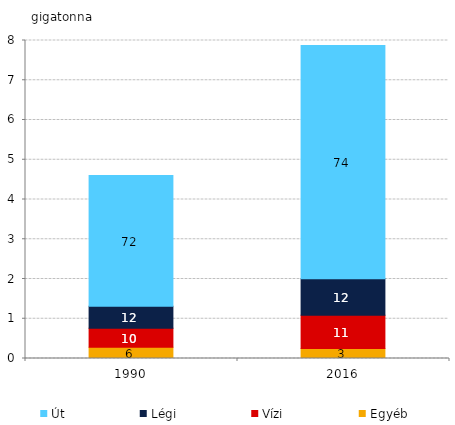
| Category | Egyéb | Vízi | Légi | Út |
|---|---|---|---|---|
| 1990.0 | 0.285 | 0.474 | 0.553 | 3.289 |
| 2016.0 | 0.253 | 0.838 | 0.917 | 5.866 |